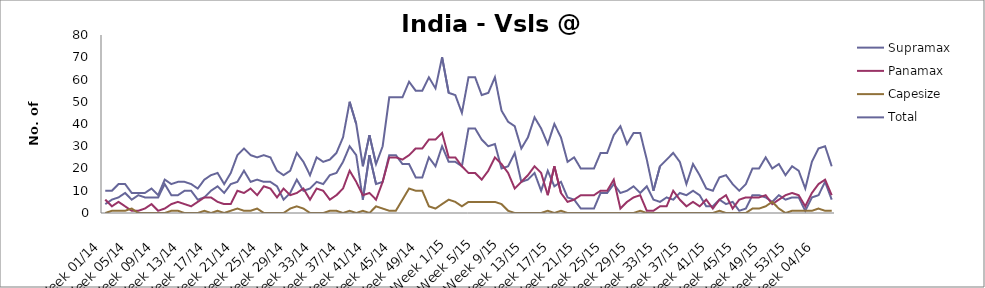
| Category | Supramax | Panamax | Capesize | Total |
|---|---|---|---|---|
| Week 01/14 | 4 | 6 | 0 | 10 |
| Week 02/14 | 6 | 3 | 1 | 10 |
| Week 03/14 | 7 | 5 | 1 | 13 |
| Week 04/14 | 9 | 3 | 1 | 13 |
| Week 05/14 | 6 | 1 | 2 | 9 |
| Week 06/14 | 8 | 1 | 0 | 9 |
| Week 07/14 | 7 | 2 | 0 | 9 |
| Week 08/14 | 7 | 4 | 0 | 11 |
| Week 09/14 | 7 | 1 | 0 | 8 |
| Week 10/14 | 13 | 2 | 0 | 15 |
| Week 11/14 | 8 | 4 | 1 | 13 |
| Week 12/14 | 8 | 5 | 1 | 14 |
| Week 13/14 | 10 | 4 | 0 | 14 |
| Week 14/14 | 10 | 3 | 0 | 13 |
| Week 15/14 | 6 | 5 | 0 | 11 |
| Week 16/14 | 7 | 7 | 1 | 15 |
| Week 17/14 | 10 | 7 | 0 | 17 |
| Week 18/14 | 12 | 5 | 1 | 18 |
| Week 19/14 | 9 | 4 | 0 | 13 |
| Week 20/14 | 13 | 4 | 1 | 18 |
| Week 21/14 | 14 | 10 | 2 | 26 |
| Week 22/14 | 19 | 9 | 1 | 29 |
| Week 23/14 | 14 | 11 | 1 | 26 |
| Week 24/14 | 15 | 8 | 2 | 25 |
| Week 25/14 | 14 | 12 | 0 | 26 |
| Week 26/14 | 14 | 11 | 0 | 25 |
| Week 27/14 | 12 | 7 | 0 | 19 |
| Week 28/14 | 6 | 11 | 0 | 17 |
| Week 29/14 | 9 | 8 | 2 | 19 |
| Week 30/14 | 15 | 9 | 3 | 27 |
| Week 31/14 | 10 | 11 | 2 | 23 |
| Week 32/14 | 11 | 6 | 0 | 17 |
| Week 33/14 | 14 | 11 | 0 | 25 |
| Week 34/14 | 13 | 10 | 0 | 23 |
| Week 35/14 | 17 | 6 | 1 | 24 |
| Week 36/14 | 18 | 8 | 1 | 27 |
| Week 37/14 | 23 | 11 | 0 | 34 |
| Week 38/14 | 30 | 19 | 1 | 50 |
| Week 39/14 | 26 | 14 | 0 | 40 |
| Week 40/14 | 6 | 8 | 1 | 21 |
| Week 41/14 | 26 | 9 | 0 | 35 |
| Week 42/14 | 13 | 6 | 3 | 22 |
| Week 43/14 | 14 | 14 | 2 | 30 |
| Week 44/14 | 26 | 25 | 1 | 52 |
| Week 45/14 | 26 | 25 | 1 | 52 |
| Week 46/14 | 22 | 24 | 6 | 52 |
| Week 47/14 | 22 | 26 | 11 | 59 |
| Week 48/14 | 16 | 29 | 10 | 55 |
| Week 49/14 | 16 | 29 | 10 | 55 |
| Week 50/14 | 25 | 33 | 3 | 61 |
| Week 51/14 | 21 | 33 | 2 | 56 |
| Week 52/14 | 30 | 36 | 4 | 70 |
| Week 1/15 | 23 | 25 | 6 | 54 |
| Week 2/15 | 23 | 25 | 5 | 53 |
| Week 3/15 | 21 | 21 | 3 | 45 |
| Week 4/15 | 38 | 18 | 5 | 61 |
| Week 5/15 | 38 | 18 | 5 | 61 |
| Week 6/15 | 33 | 15 | 5 | 53 |
| Week 7/15 | 30 | 19 | 5 | 54 |
| Week 8/15 | 31 | 25 | 5 | 61 |
| Week 9/15 | 20 | 22 | 4 | 46 |
| Week 10/15 | 21 | 18 | 1 | 41 |
| Week 11/15 | 27 | 11 | 0 | 39 |
| Week 12/15 | 14 | 14 | 0 | 29 |
| Week 13/15 | 15 | 17 | 0 | 34 |
| Week 14/15 | 18 | 21 | 0 | 43 |
| Week 15/15 | 10 | 18 | 0 | 38 |
| Week 16/15 | 19 | 8 | 1 | 31 |
| Week 17/15 | 12 | 21 | 0 | 40 |
| Week 18/15 | 14 | 9 | 1 | 34 |
| Week 19/15 | 7 | 5 | 0 | 23 |
| Week 20/15 | 6 | 6 | 0 | 25 |
| Week 21/15 | 2 | 8 | 0 | 20 |
| Week 22/15 | 2 | 8 | 0 | 20 |
| Week 23/15 | 2 | 8 | 0 | 20 |
| Week 24/15 | 9 | 10 | 0 | 27 |
| Week 25/15 | 9 | 10 | 0 | 27 |
| Week 26/15 | 13 | 15 | 0 | 35 |
| Week 27/15 | 9 | 2 | 0 | 39 |
| Week 28/15 | 10 | 5 | 0 | 31 |
| Week 29/15 | 12 | 7 | 0 | 36 |
| Week 30/15 | 9 | 8 | 1 | 36 |
| Week 31/15 | 12 | 1 | 0 | 24 |
| Week 32/15 | 6 | 1 | 0 | 10 |
| Week 33/15 | 5 | 3 | 0 | 21 |
| Week 34/15 | 7 | 3 | 0 | 24 |
| Week 35/15 | 6 | 10 | 0 | 27 |
| Week 36/15 | 9 | 6 | 0 | 23 |
| Week 37/15 | 8 | 3 | 0 | 13 |
| Week 38/15 | 10 | 5 | 0 | 22 |
| Week 39/15 | 8 | 3 | 0 | 17 |
| Week 40/15 | 3 | 6 | 0 | 11 |
| Week 41/15 | 3 | 2 | 0 | 10 |
| Week 42/15 | 6 | 6 | 1 | 16 |
| Week 43/15 | 4 | 8 | 0 | 17 |
| Week 44/15 | 5 | 2 | 0 | 13 |
| Week 45/15 | 1 | 6 | 0 | 10 |
| Week 46/15 | 2 | 7 | 0 | 13 |
| Week 47/15 | 8 | 7 | 2 | 20 |
| Week 48/15 | 8 | 7 | 2 | 20 |
| Week 49/15 | 7 | 8 | 3 | 25 |
| Week 50/15 | 5 | 4 | 5 | 20 |
| Week 51/15 | 8 | 6 | 2 | 22 |
| Week 52/15 | 6 | 8 | 0 | 17 |
| Week 53/15 | 7 | 9 | 1 | 21 |
| Week 01/16 | 7 | 8 | 1 | 19 |
| Week 02/16 | 1 | 3 | 1 | 11 |
| Week 03/16 | 7 | 9 | 1 | 23 |
| Week 04/16 | 8 | 13 | 2 | 29 |
| Week 05/16 | 14 | 15 | 1 | 30 |
| Week 06/16 | 6 | 8 | 1 | 21 |